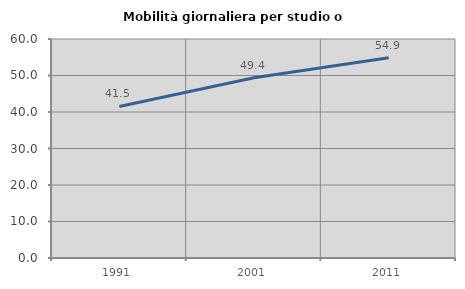
| Category | Mobilità giornaliera per studio o lavoro |
|---|---|
| 1991.0 | 41.518 |
| 2001.0 | 49.401 |
| 2011.0 | 54.887 |